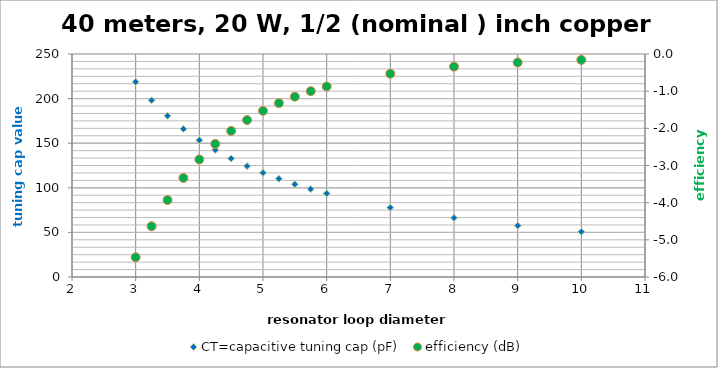
| Category | CT=capacitive tuning cap (pF) |
|---|---|
| 3.0 | 218.718 |
| 3.25 | 198.058 |
| 3.5 | 180.732 |
| 3.75 | 166.012 |
| 4.0 | 153.364 |
| 4.25 | 142.39 |
| 4.5 | 132.786 |
| 4.75 | 124.316 |
| 5.0 | 116.796 |
| 5.25 | 110.078 |
| 5.5 | 104.043 |
| 5.75 | 98.594 |
| 6.0 | 93.653 |
| 7.0 | 77.79 |
| 8.0 | 66.289 |
| 9.0 | 57.597 |
| 10.0 | 50.814 |